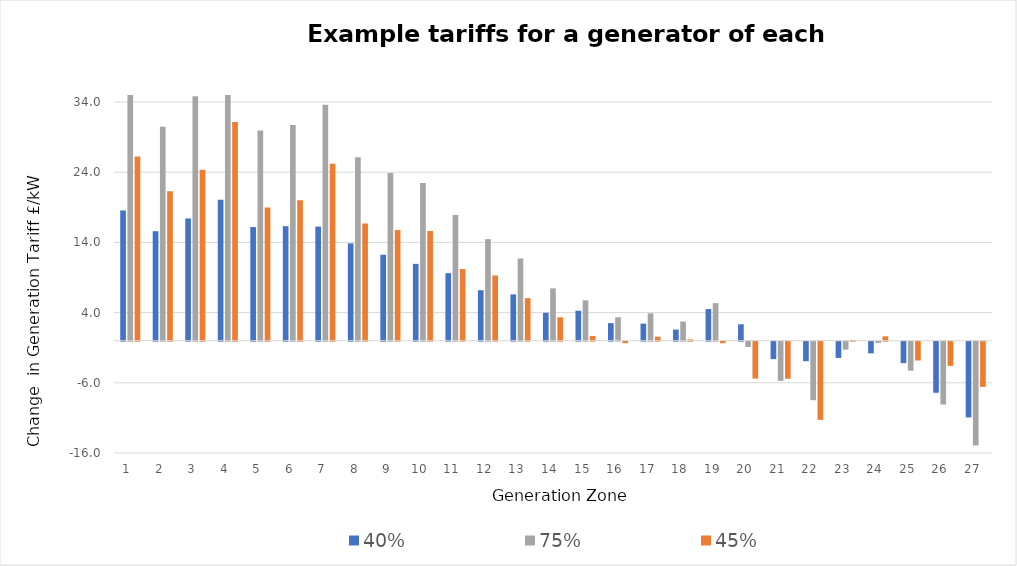
| Category | 40% | 75% | 45% |
|---|---|---|---|
| 1.0 | 18.533 | 37.266 | 26.25 |
| 2.0 | 15.596 | 30.468 | 21.286 |
| 3.0 | 17.417 | 34.835 | 24.366 |
| 4.0 | 20.072 | 41.564 | 31.155 |
| 5.0 | 16.187 | 29.925 | 18.971 |
| 6.0 | 16.315 | 30.725 | 19.997 |
| 7.0 | 16.253 | 33.614 | 25.213 |
| 8.0 | 13.865 | 26.115 | 16.695 |
| 9.0 | 12.246 | 23.873 | 15.759 |
| 10.0 | 10.943 | 22.479 | 15.63 |
| 11.0 | 9.62 | 17.903 | 10.208 |
| 12.0 | 7.188 | 14.468 | 9.293 |
| 13.0 | 6.595 | 11.711 | 6.06 |
| 14.0 | 3.977 | 7.457 | 3.333 |
| 15.0 | 4.269 | 5.746 | 0.661 |
| 16.0 | 2.496 | 3.339 | -0.213 |
| 17.0 | 2.433 | 3.889 | 0.575 |
| 18.0 | 1.578 | 2.729 | 0.183 |
| 19.0 | 4.506 | 5.344 | -0.218 |
| 20.0 | 2.337 | -0.746 | -5.261 |
| 21.0 | -2.485 | -5.582 | -5.278 |
| 22.0 | -2.775 | -8.335 | -11.131 |
| 23.0 | -2.317 | -1.133 | 0.106 |
| 24.0 | -1.664 | -0.17 | 0.625 |
| 25.0 | -3.054 | -4.128 | -2.678 |
| 26.0 | -7.28 | -8.955 | -3.451 |
| 27.0 | -10.787 | -14.786 | -6.438 |